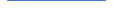
| Category | Series 0 |
|---|---|
| 0 | 44 |
| 1 | 37 |
| 2 | 29 |
| 3 | 41 |
| 4 | 39 |
| 5 | 38 |
| 6 | 39 |
| 7 | 38 |
| 8 | 25 |